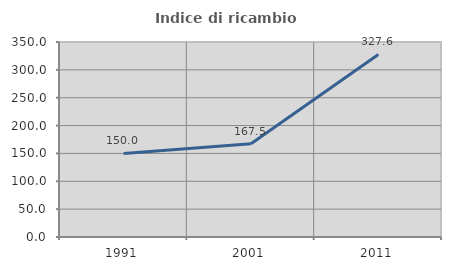
| Category | Indice di ricambio occupazionale  |
|---|---|
| 1991.0 | 150 |
| 2001.0 | 167.476 |
| 2011.0 | 327.607 |